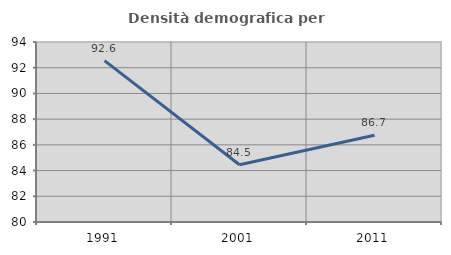
| Category | Densità demografica |
|---|---|
| 1991.0 | 92.553 |
| 2001.0 | 84.456 |
| 2011.0 | 86.743 |